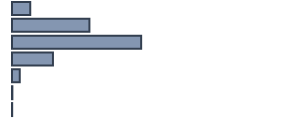
| Category | Series 0 |
|---|---|
| 0 | 6.639 |
| 1 | 28.252 |
| 2 | 47.139 |
| 3 | 14.945 |
| 4 | 2.824 |
| 5 | 0.136 |
| 6 | 0.066 |